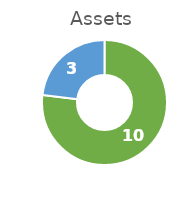
| Category | Amount |
|---|---|
| Met | 10 |
| Missed | 3 |